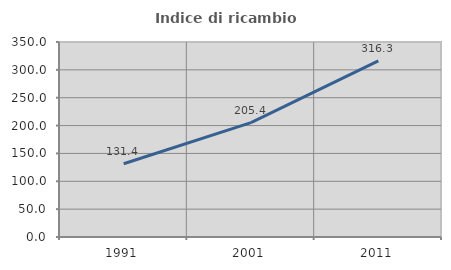
| Category | Indice di ricambio occupazionale  |
|---|---|
| 1991.0 | 131.405 |
| 2001.0 | 205.357 |
| 2011.0 | 316.268 |